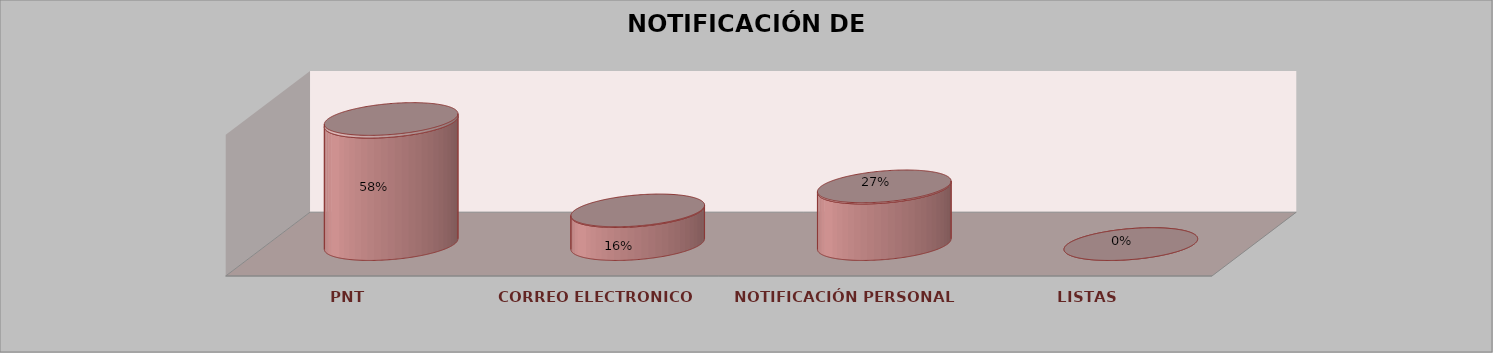
| Category | Series 0 | Series 1 | Series 2 | Series 3 | Series 4 |
|---|---|---|---|---|---|
| PNT |  |  |  | 26 | 0.578 |
| CORREO ELECTRONICO |  |  |  | 7 | 0.156 |
| NOTIFICACIÓN PERSONAL |  |  |  | 12 | 0.267 |
| LISTAS |  |  |  | 0 | 0 |